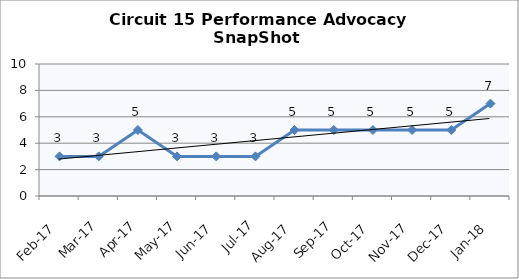
| Category | Circuit 15 |
|---|---|
| Feb-17 | 3 |
| Mar-17 | 3 |
| Apr-17 | 5 |
| May-17 | 3 |
| Jun-17 | 3 |
| Jul-17 | 3 |
| Aug-17 | 5 |
| Sep-17 | 5 |
| Oct-17 | 5 |
| Nov-17 | 5 |
| Dec-17 | 5 |
| Jan-18 | 7 |